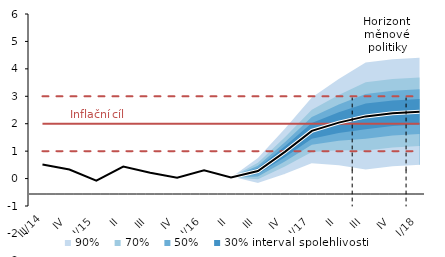
| Category | Inflation Target | Inflation Target - lower bound | Inflation Target - upper bound | linka | Střed předpovědi |
|---|---|---|---|---|---|
| III/14 | 2 | 1 | 3 | 0.511 | 0.511 |
| IV | 2 | 1 | 3 | 0.329 | 0.329 |
| I/15 | 2 | 1 | 3 | -0.076 | -0.076 |
| II | 2 | 1 | 3 | 0.439 | 0.439 |
| III | 2 | 1 | 3 | 0.212 | 0.212 |
| IV | 2 | 1 | 3 | 0.028 | 0.028 |
| I/16 | 2 | 1 | 3 | 0.305 | 0.305 |
| II | 2 | 1 | 3 | 0.039 | 0.039 |
| III | 2 | 1 | 3 | 0.275 | 0.275 |
| IV | 2 | 1 | 3 | 0.974 | 0.974 |
| I/17 | 2 | 1 | 3 | 1.738 | 1.738 |
| II | 2 | 1 | 3 | 2.041 | 2.041 |
| III | 2 | 1 | 3 | 2.267 | 2.267 |
| IV | 2 | 1 | 3 | 2.382 | 2.382 |
| I/18 | 2 | 1 | 3 | 2.437 | 2.437 |